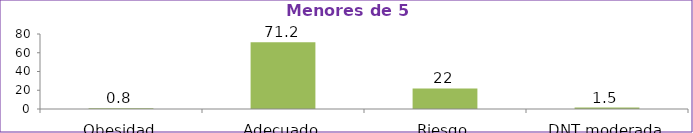
| Category | Series 0 |
|---|---|
| Obesidad | 0.8 |
| Adecuado | 71.2 |
| Riesgo | 22 |
| DNT moderada | 1.5 |